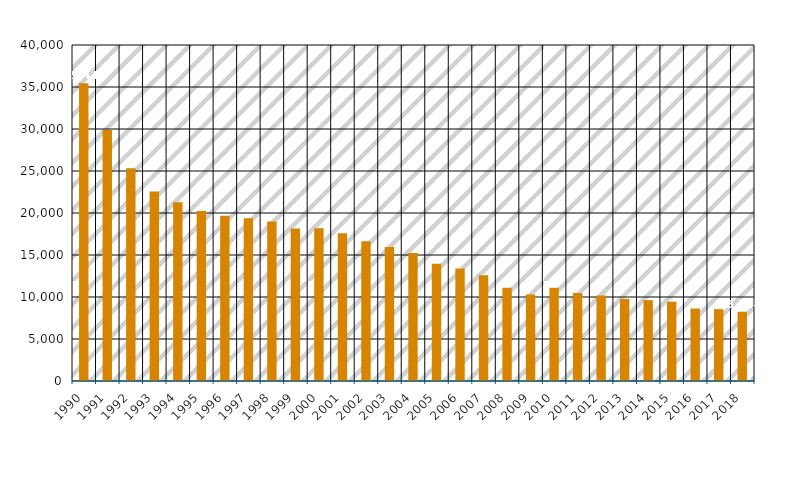
| Category | Quecksilber |
|---|---|
| 1990.0 | 35449 |
| 1991.0 | 29873 |
| 1992.0 | 25326 |
| 1993.0 | 22565 |
| 1994.0 | 21285 |
| 1995.0 | 20228 |
| 1996.0 | 19662 |
| 1997.0 | 19363 |
| 1998.0 | 18994 |
| 1999.0 | 18165 |
| 2000.0 | 18183 |
| 2001.0 | 17578 |
| 2002.0 | 16625 |
| 2003.0 | 15946 |
| 2004.0 | 15245 |
| 2005.0 | 13951 |
| 2006.0 | 13393 |
| 2007.0 | 12603 |
| 2008.0 | 11096 |
| 2009.0 | 10303 |
| 2010.0 | 11092 |
| 2011.0 | 10475 |
| 2012.0 | 10170 |
| 2013.0 | 9776 |
| 2014.0 | 9629 |
| 2015.0 | 9445 |
| 2016.0 | 8632 |
| 2017.0 | 8549 |
| 2018.0 | 8248 |